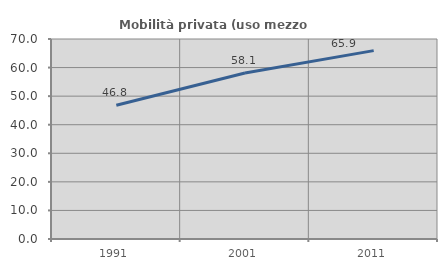
| Category | Mobilità privata (uso mezzo privato) |
|---|---|
| 1991.0 | 46.798 |
| 2001.0 | 58.101 |
| 2011.0 | 65.932 |